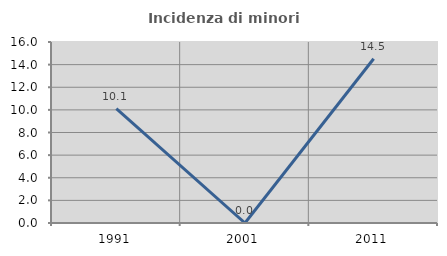
| Category | Incidenza di minori stranieri |
|---|---|
| 1991.0 | 10.116 |
| 2001.0 | 0 |
| 2011.0 | 14.516 |